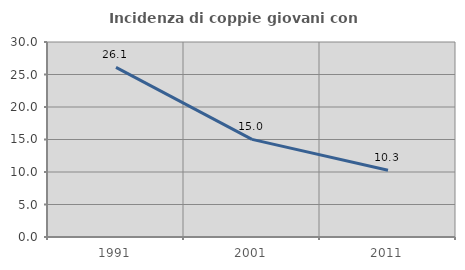
| Category | Incidenza di coppie giovani con figli |
|---|---|
| 1991.0 | 26.087 |
| 2001.0 | 15.018 |
| 2011.0 | 10.279 |